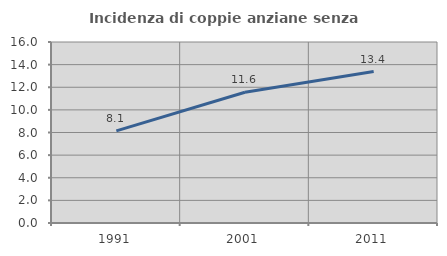
| Category | Incidenza di coppie anziane senza figli  |
|---|---|
| 1991.0 | 8.143 |
| 2001.0 | 11.559 |
| 2011.0 | 13.39 |